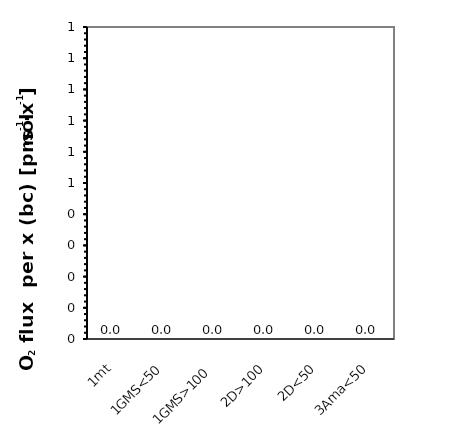
| Category | O2 flux per x (bc) |
|---|---|
| 1mt | 0 |
| 1GMS<50 | 0 |
| 1GMS>100 | 0 |
| 2D>100 | 0 |
| 2D<50 | 0 |
| 3Ama<50 | 0 |